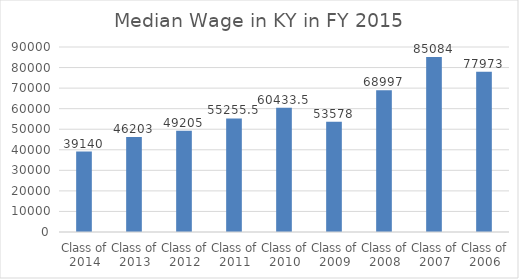
| Category | Median Wage in KY in FY 2015 |
|---|---|
| Class of 2014 | 39140 |
| Class of 2013 | 46203 |
| Class of 2012 | 49205 |
| Class of 2011 | 55255.5 |
| Class of 2010 | 60433.5 |
| Class of 2009 | 53578 |
| Class of 2008 | 68997 |
| Class of 2007 | 85084 |
| Class of 2006 | 77973 |